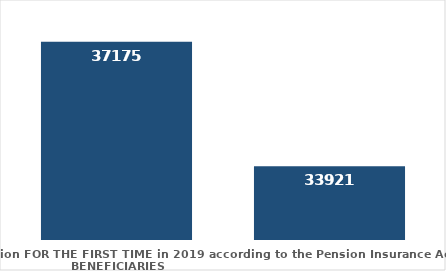
| Category | broj korisnika |
|---|---|
| Pension beneficiaries entitled to pension FOR THE FIRST TIME in 2019 according to the Pension Insurance Act  - NEW BENEFICIARIES | 37175 |
| Pension beneficiaries whose pension entitlement ceased in 2019  -  death caused,   
and who were retired according to the Pension Insurance Act   | 33921 |